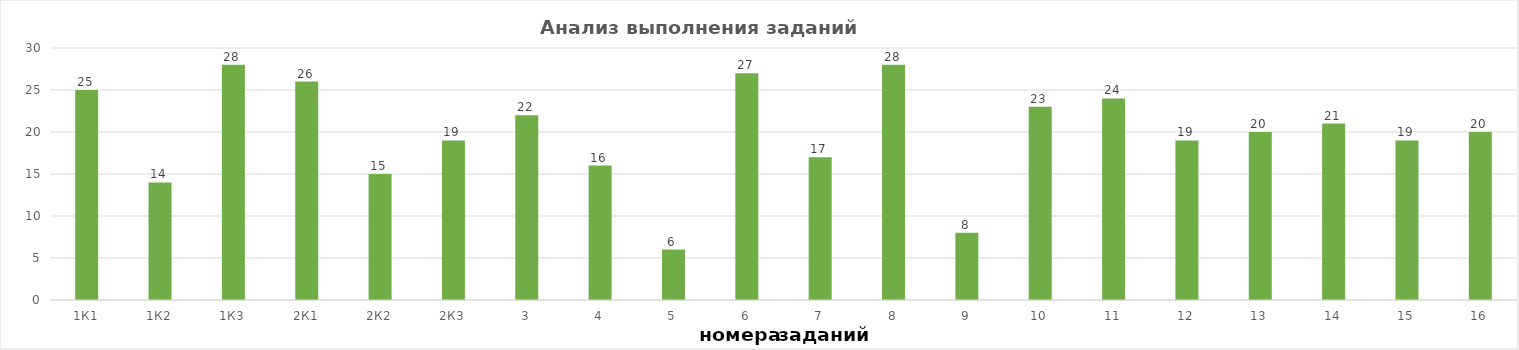
| Category | задания |
|---|---|
| 1К1 | 25 |
| 1К2 | 14 |
| 1К3 | 28 |
| 2К1 | 26 |
| 2К2 | 15 |
| 2К3 | 19 |
| 3 | 22 |
| 4 | 16 |
| 5 | 6 |
| 6 | 27 |
| 7 | 17 |
| 8 | 28 |
| 9 | 8 |
| 10 | 23 |
| 11 | 24 |
| 12 | 19 |
| 13 | 20 |
| 14 | 21 |
| 15 | 19 |
| 16 | 20 |